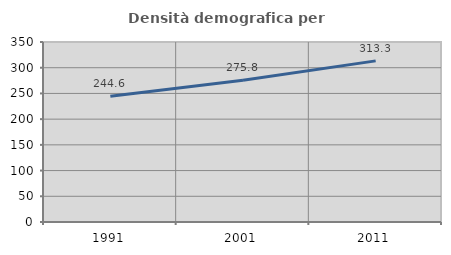
| Category | Densità demografica |
|---|---|
| 1991.0 | 244.633 |
| 2001.0 | 275.822 |
| 2011.0 | 313.326 |